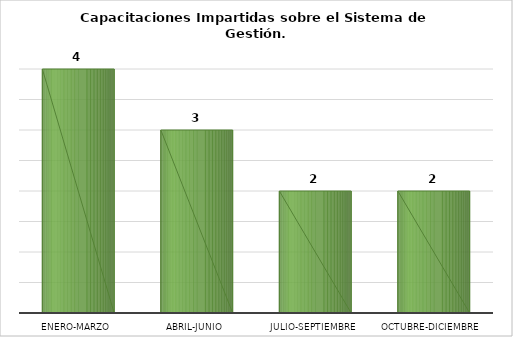
| Category | Capacitaciones impartidas |
|---|---|
| Enero-Marzo | 4 |
| Abril-Junio | 3 |
| Julio-Septiembre | 2 |
| Octubre-Diciembre | 2 |